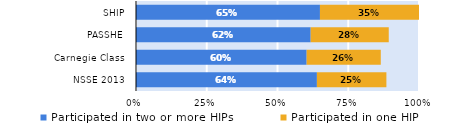
| Category | Participated in two or more HIPs | Participated in one HIP |
|---|---|---|
| NSSE 2013 | 0.639 | 0.246 |
| Carnegie Class | 0.603 | 0.262 |
| PASSHE | 0.617 | 0.276 |
| SHIP | 0.65 | 0.35 |